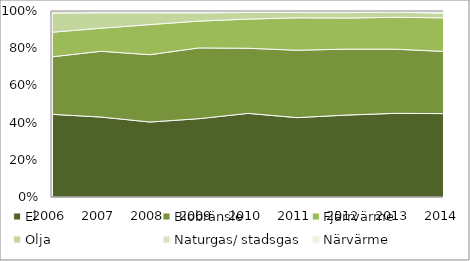
| Category | El | Biobränsle | Fjärrvärme | Olja | Naturgas/ stadsgas | Närvärme |
|---|---|---|---|---|---|---|
| 2006.0 | 0.447 | 0.311 | 0.133 | 0.103 | 0.009 | 0.003 |
| 2007.0 | 0.43 | 0.354 | 0.124 | 0.083 | 0.006 | 0.003 |
| 2008.0 | 0.403 | 0.362 | 0.162 | 0.063 | 0.006 | 0.003 |
| 2009.0 | 0.421 | 0.381 | 0.144 | 0.044 | 0.006 | 0.004 |
| 2010.0 | 0.45 | 0.35 | 0.157 | 0.036 | 0.006 | 0.002 |
| 2011.0 | 0.427 | 0.362 | 0.174 | 0.028 | 0.004 | 0.005 |
| 2012.0 | 0.44 | 0.355 | 0.167 | 0.029 | 0.005 | 0.004 |
| 2013.0 | 0.45 | 0.345 | 0.172 | 0.028 | 0.003 | 0.003 |
| 2014.0 | 0.448 | 0.335 | 0.18 | 0.024 | 0.008 | 0.005 |